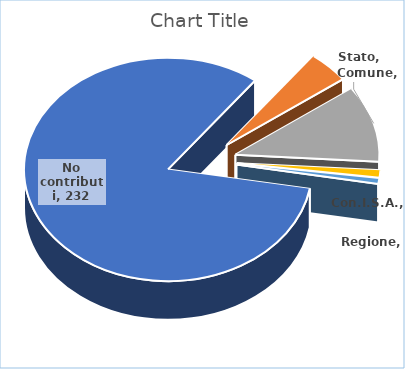
| Category | Series 0 |
|---|---|
| No contributi | 232 |
| Stato | 13 |
| Comune | 31 |
| Con.I.S.A. | 3 |
| Regione | 2 |